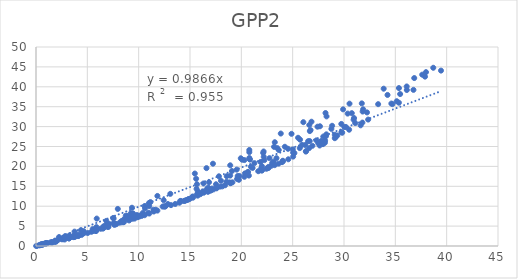
| Category | GPP2 |
|---|---|
| 15.469568014204931 | 18.208 |
| 17.61169339019748 | 14.636 |
| 8.347747169514726 | 5.945 |
| 22.636057179232314 | 19.865 |
| 3.7983804133441503 | 2.312 |
| 29.104151819554996 | 27.087 |
| 30.760233429198536 | 33.376 |
| 18.976175167297615 | 15.836 |
| 15.69271986933751 | 13.048 |
| 3.753191674882236 | 3.611 |
| 16.344012970278587 | 13.392 |
| 29.91154459669844 | 34.334 |
| 9.113769045492608 | 6.765 |
| 21.868154021804777 | 21.113 |
| 20.298568293086838 | 17.384 |
| 30.500520762441774 | 29.214 |
| 35.347821270472345 | 36.003 |
| 33.32619909256462 | 35.637 |
| 26.62047410137453 | 30.409 |
| 18.55075474517455 | 16.145 |
| 10.579039330347193 | 10.037 |
| 30.186376809063898 | 29.903 |
| 23.628424325291444 | 20.697 |
| 29.73950423332554 | 30.67 |
| 6.604670739594066 | 4.887 |
| 22.182411795156767 | 22.405 |
| 17.0373700447409 | 13.939 |
| 27.493500797597118 | 25.819 |
| 28.142475752599832 | 25.95 |
| 5.91545612661903 | 6.888 |
| 24.576844674138105 | 21.788 |
| 27.932874757011913 | 25.98 |
| 29.82399974126913 | 28.452 |
| 9.956183399512371 | 7.607 |
| 9.065629961421623 | 6.903 |
| 10.617523373266561 | 9.446 |
| 23.96587663929172 | 21.071 |
| 8.533743698861885 | 5.976 |
| 7.636855069400743 | 5.299 |
| 2.657069645616239 | 1.888 |
| 17.23612104098722 | 20.676 |
| 14.75908371703632 | 11.623 |
| 3.965786549548763 | 2.572 |
| 28.085081017438583 | 26.374 |
| 7.96713474445528 | 9.314 |
| 36.76609357791857 | 39.228 |
| 2.7983349140414386 | 1.637 |
| 20.735401900183568 | 17.692 |
| 27.654741693188654 | 25.695 |
| 22.170784869426786 | 23.744 |
| 0.5172400361761035 | 0.432 |
| 11.82343123983035 | 12.578 |
| 20.076249414914734 | 21.679 |
| 17.579869965053177 | 14.484 |
| 5.398659576180982 | 3.568 |
| 15.761710981708607 | 13.712 |
| 37.892356257786076 | 42.551 |
| 4.101252734239716 | 2.863 |
| 9.446343972944902 | 8.197 |
| 10.287254012368084 | 7.651 |
| 8.558231237926611 | 6.687 |
| 23.18538616937913 | 24.913 |
| 5.852959701343817 | 3.795 |
| 35.35010360199377 | 39.682 |
| 26.502891959396777 | 26.323 |
| 31.814890199816112 | 33.785 |
| 15.290080063494567 | 12.139 |
| 7.57402932402929 | 5.784 |
| 26.67283085125176 | 28.872 |
| 16.60556784557633 | 19.569 |
| 5.791516510582452 | 4.312 |
| 15.267294744764923 | 12.443 |
| 27.698487646559034 | 26.087 |
| 23.504000819989066 | 24.596 |
| 14.67781966994701 | 11.555 |
| 19.54769627801956 | 19.193 |
| 16.851777581279347 | 16.03 |
| 1.5851014687024647 | 0.878 |
| 28.29923160881774 | 32.563 |
| 8.967193732151362 | 6.83 |
| 6.985538185135134 | 4.866 |
| 31.617989072173597 | 30.319 |
| 9.23179661002362 | 8.21 |
| 25.526923715022487 | 27.192 |
| 27.992483688893802 | 27.505 |
| 11.477974869096649 | 8.825 |
| 1.54834589350693 | 0.941 |
| 5.750261662854806 | 4.173 |
| 1.842794428073723 | 1.218 |
| 20.344513328148352 | 18.231 |
| 9.347641260341353 | 9.616 |
| 25.694190862424225 | 24.596 |
| 20.60788811517762 | 18.492 |
| 5.88783076471983 | 4.747 |
| 0.768712575414792 | 0.553 |
| 8.134730841742401 | 5.854 |
| 14.13935938179317 | 11.255 |
| 18.915750725996965 | 17.691 |
| 4.609636603250739 | 3.267 |
| 7.512119592193789 | 7.035 |
| 3.6545097792893855 | 2.238 |
| 34.611902114364746 | 35.793 |
| 6.599881543044361 | 4.576 |
| 7.717635878358566 | 5.574 |
| 37.61839339439872 | 43.048 |
| 11.001916052537743 | 10.778 |
| 30.976701093480383 | 32.147 |
| 2.8372487681613014 | 2.489 |
| 0.9025174759356984 | 0.637 |
| 20.84293605832469 | 21.719 |
| 24.888560636610897 | 28.186 |
| 9.394881326574795 | 6.853 |
| 18.412668294558365 | 15.248 |
| 5.8803150425705155 | 4.31 |
| 7.136244396353404 | 5.537 |
| 5.0402066522881475 | 3.264 |
| 17.13577559780985 | 14.433 |
| 10.110568956350178 | 7.614 |
| 14.449696140584434 | 11.329 |
| 7.561460821400472 | 6.911 |
| 5.802883321964959 | 3.787 |
| 34.71628540075178 | 35.654 |
| 6.951633726714673 | 4.845 |
| 32.241811108773554 | 33.568 |
| 7.809656176202383 | 5.466 |
| 3.749555394934245 | 2.394 |
| 3.2509972105963105 | 2.129 |
| 14.051742581295125 | 11.327 |
| 9.859567108135609 | 7.453 |
| 10.941480199306922 | 8.346 |
| 31.791829006617203 | 31.006 |
| 9.093096775003303 | 6.945 |
| 39.44881009683575 | 44.069 |
| 6.624579527942853 | 4.94 |
| 8.745130311965923 | 7.599 |
| 2.634650676506008 | 1.693 |
| 31.094169605523742 | 30.883 |
| 3.692506109338636 | 2.254 |
| 22.57554353358829 | 19.57 |
| 6.559609034189098 | 4.859 |
| 30.034139904043975 | 29.888 |
| 19.762766411649018 | 16.629 |
| 20.93407557270366 | 19.903 |
| 23.25026714226333 | 20.309 |
| 36.84179906427357 | 42.196 |
| 19.804908458270983 | 17.596 |
| 1.0523566522028338 | 0.746 |
| 28.8418033232448 | 30.204 |
| 23.0097958742414 | 20.856 |
| 11.146737186559216 | 11.031 |
| 11.447370561107698 | 9.093 |
| 5.518507451884318 | 4.238 |
| 23.259719458288174 | 26.072 |
| 12.848509464355118 | 10.548 |
| 28.157799389522552 | 26.51 |
| 27.628294320088337 | 25.249 |
| 19.586116556556888 | 16.849 |
| 9.60550271586918 | 6.885 |
| 13.973689884317457 | 10.873 |
| 2.542961581830675 | 1.836 |
| 0.5507543241471661 | 0.284 |
| 16.246272087335356 | 13.732 |
| 12.435874286309378 | 11.516 |
| 15.639498553700914 | 14.354 |
| 4.169915744780302 | 2.594 |
| 30.935006620734057 | 31.725 |
| 6.877237799009159 | 5.381 |
| 36.10726721422582 | 40.083 |
| 3.6409592033108735 | 2.412 |
| 24.23975756634717 | 24.929 |
| 9.825525925718647 | 7.77 |
| 19.084300325787282 | 18.84 |
| 19.13208122763338 | 15.998 |
| 34.238927859699515 | 37.954 |
| 14.43935186296988 | 11.336 |
| 2.2447454838308865 | 2.247 |
| 9.071819449842964 | 6.416 |
| 16.748020832964627 | 13.607 |
| 19.947248321945768 | 22.039 |
| 10.327153517675335 | 7.623 |
| 17.288749885084307 | 14.217 |
| 5.843808300025983 | 3.792 |
| 10.399645572274698 | 8.292 |
| 4.379173675661099 | 3.984 |
| 11.823640398531513 | 8.893 |
| 4.110944320948573 | 2.503 |
| 10.092138461428192 | 7.444 |
| 3.690023860638628 | 2.389 |
| 11.471684300307597 | 8.669 |
| 27.4163759857817 | 29.974 |
| 0.35468313117825556 | 0.169 |
| 28.770912232273023 | 29.43 |
| 18.580021906616658 | 17.531 |
| 24.040930115420892 | 21.418 |
| 25.048044160330754 | 22.462 |
| 9.205060539725014 | 7.083 |
| 0.622818014751064 | 0.316 |
| 6.8441485976974805 | 6.314 |
| 14.837036168572059 | 11.708 |
| 5.553692063796396 | 3.778 |
| 13.082606901693259 | 13.108 |
| 13.559176970164525 | 10.56 |
| 11.0370755076588 | 8.156 |
| 20.653560583014233 | 18.621 |
| 31.864890277119365 | 34.347 |
| 35.13711551927584 | 36.373 |
| 21.941958426770324 | 19.551 |
| 17.10471763237633 | 14.13 |
| 15.596672663523854 | 16.888 |
| 7.0544010596034505 | 4.792 |
| 21.6472891306811 | 18.791 |
| 0.10425176951279673 | 0.048 |
| 29.10346795400624 | 27.94 |
| 11.030572916032998 | 10.007 |
| 12.62490726365859 | 10.021 |
| 9.352515325217333 | 7.6 |
| 8.888705320014799 | 7.54 |
| 25.013515341388853 | 24.273 |
| 28.24311297862953 | 27.599 |
| 20.778488290386665 | 24.126 |
| 26.2821589416826 | 23.72 |
| 0.6316016177044335 | 0.51 |
| 18.834534216596296 | 15.992 |
| 21.096098206782777 | 19.608 |
| 14.874686008662467 | 11.763 |
| 30.536918968016625 | 35.762 |
| 1.1204793304672263 | 0.727 |
| 25.03922699153618 | 23.46 |
| 25.918789360585873 | 25.419 |
| 1.8995376567078683 | 1.254 |
| 12.334229507458408 | 9.898 |
| 27.658916243952177 | 30.08 |
| 27.951825119256544 | 25.59 |
| 16.318225743975 | 15.71 |
| 3.421062256464021 | 2.283 |
| 0.9728857953472213 | 0.634 |
| 3.222784781641937 | 1.9 |
| 2.1370735217723325 | 1.514 |
| 0.014800437499556849 | 0.007 |
| 0.6742483593711994 | 0.393 |
| 11.661410651130234 | 9.118 |
| 8.552379860245608 | 6.024 |
| 15.678021364008291 | 15.521 |
| 16.775632920527237 | 14.692 |
| 18.934008156202747 | 15.785 |
| 26.609724037051844 | 24.604 |
| 0.30681270829844937 | 0.213 |
| 26.65874137216146 | 26.368 |
| 16.016411139555895 | 13.019 |
| 23.424490908362333 | 22.07 |
| 9.006742553023575 | 6.628 |
| 0.9848009872954621 | 0.627 |
| 14.58627482080347 | 11.461 |
| 36.119477175642 | 39.198 |
| 4.637886123386688 | 3.734 |
| 8.323727143634676 | 6.273 |
| 12.564039387568119 | 9.886 |
| 10.351022145595955 | 7.807 |
| 22.129829080455714 | 23.375 |
| 3.255610058444818 | 2.656 |
| 1.4033088839452246 | 0.894 |
| 22.0309724931532 | 19.066 |
| 22.44341879595661 | 19.407 |
| 33.86631006458194 | 39.523 |
| 22.24886657175092 | 21.579 |
| 14.980584193125402 | 11.845 |
| 21.985138901268545 | 18.932 |
| 18.01400001492527 | 16.392 |
| 31.73359653982384 | 35.834 |
| 25.71910719999843 | 26.723 |
| 29.167872799021332 | 27.293 |
| 27.77331710839372 | 26.379 |
| 26.923802410656407 | 25.178 |
| 2.499439271237236 | 1.695 |
| 16.866196250633113 | 13.839 |
| 13.147734533772695 | 10.265 |
| 4.447354051059242 | 2.793 |
| 23.147999477861163 | 21.2 |
| 0.45255059030694095 | 0.334 |
| 38.69393785666636 | 44.78 |
| 26.7441308442192 | 29.124 |
| 18.917000265952694 | 20.275 |
| 12.455850243343525 | 9.961 |
| 0.9329236403379144 | 0.692 |
| 30.35514699877701 | 33.269 |
| 23.643827993738203 | 24.121 |
| 22.738643175321606 | 22.071 |
| 3.212492034281348 | 1.908 |
| 32.35722112262567 | 31.768 |
| 20.77721140787989 | 23.574 |
| 18.144790007706014 | 14.976 |
| 21.274139922942794 | 20.824 |
| 6.51941433974495 | 4.362 |
| 1.9555495397192542 | 1.213 |
| 9.953964371491125 | 7.342 |
| 19.643171980740348 | 17.575 |
| 24.547069833657755 | 24.426 |
| 28.283578922217593 | 28.055 |
| 24.05519779736314 | 21.285 |
| 1.9741269234569967 | 1.131 |
| 9.879896780679035 | 7.238 |
| 22.92802463287558 | 20.164 |
| 3.2037943217936014 | 2.358 |
| 1.850323453478711 | 1.019 |
| 28.19928782841787 | 33.417 |
| 20.77879328730335 | 22.115 |
| 27.307735532433053 | 26.534 |
| 3.0079797726015522 | 2.116 |
| 22.656055940519206 | 19.629 |
| 4.6720596347774315 | 3.215 |
| 17.532314436685734 | 15.51 |
| 29.752409393544887 | 28.656 |
| 3.675268426966167 | 2.615 |
| 16.633402065759945 | 14.287 |
| 26.03935061703618 | 31.111 |
| 29.357111761689485 | 27.774 |
| 20.80129112188114 | 21.843 |
| 1.8603196358070964 | 1.33 |
| 23.84087411092351 | 28.256 |
| 15.214968481744444 | 12.284 |
| 26.222452820280875 | 25.372 |
| 3.7847571845367907 | 2.507 |
| 25.168885296975176 | 23.357 |
| 17.932001169969897 | 14.923 |
| 26.83429434308613 | 31.225 |
| 20.296083550359867 | 21.589 |
| 0.42820288831120396 | 0.314 |
| 10.583799223640142 | 7.734 |
| 17.818393271290212 | 17.51 |
| 0.9362343871105366 | 0.592 |
| 35.4685480805975 | 38.178 |
| 37.98645037939083 | 43.685 |
| 22.00183120592442 | 20.058 |
| 6.293895323036994 | 4.333 |
| 15.750106115248375 | 12.652 |
| 26.319818926960515 | 23.886 |